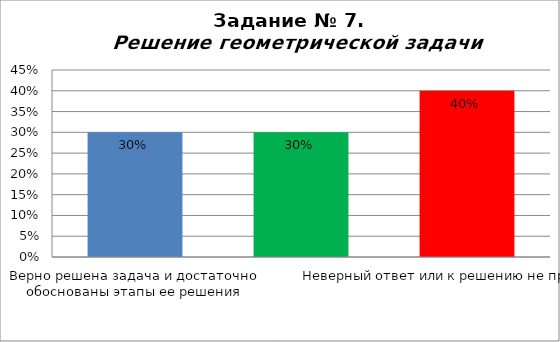
| Category | Решение геометрической задачи  |
|---|---|
| Верно решена задача и достаточно обоснованы этапы ее решения | 0.3 |
| Верное решение, недостаточно обоснованы решения или получен неверный ответ из-за вычмслительной ошибки, но при этом все этапы верные и достаточно обоснованные | 0.3 |
| Неверный ответ или к решению не приступал | 0.4 |